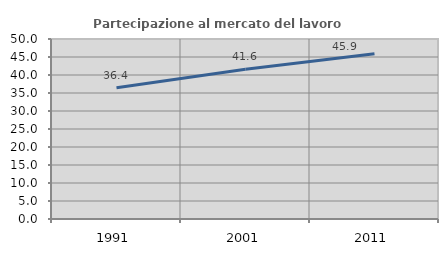
| Category | Partecipazione al mercato del lavoro  femminile |
|---|---|
| 1991.0 | 36.448 |
| 2001.0 | 41.621 |
| 2011.0 | 45.922 |